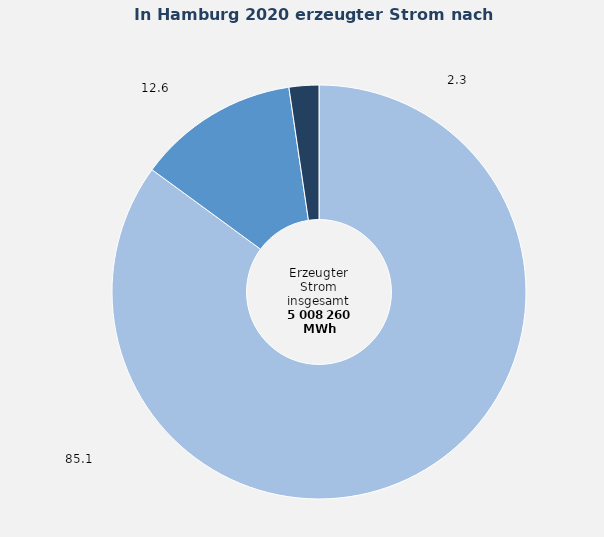
| Category | Anteil in Prozent |
|---|---|
| Fossile Energieträger | 85.061 |
| Erneuerbare Energien | 12.614 |
| Abfälle und sonstige Energieträger | 2.325 |